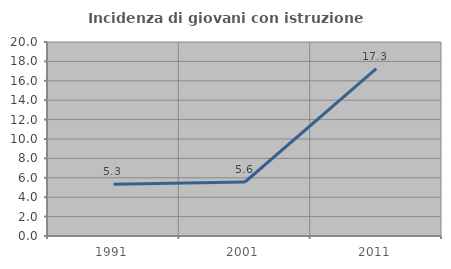
| Category | Incidenza di giovani con istruzione universitaria |
|---|---|
| 1991.0 | 5.341 |
| 2001.0 | 5.568 |
| 2011.0 | 17.256 |